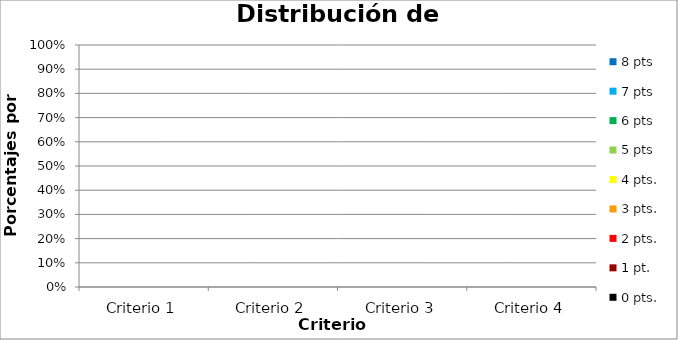
| Category | 8 pts | 7 pts | 6 pts | 5 pts | 4 pts. | 3 pts. | 2 pts. | 1 pt. | 0 pts. |
|---|---|---|---|---|---|---|---|---|---|
| Criterio 1 | 0 | 0 | 0 | 0 | 0 | 0 | 0 | 0 | 0 |
| Criterio 2 | 0 | 0 | 0 | 0 | 0 | 0 | 0 | 0 | 0 |
| Criterio 3 | 0 | 0 | 0 | 0 | 0 | 0 | 0 | 0 | 0 |
| Criterio 4 | 0 | 0 | 0 | 0 | 0 | 0 | 0 | 0 | 0 |